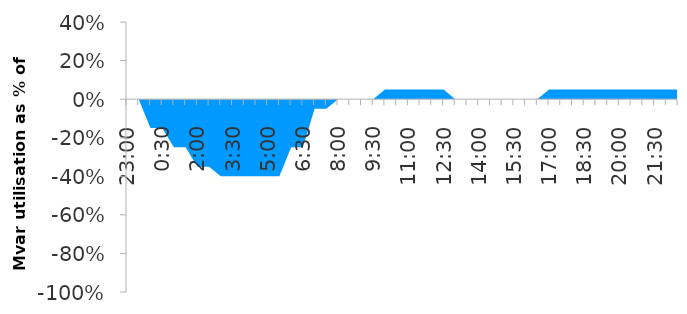
| Category | Series 0 |
|---|---|
| 0.9583333333333334 | 0 |
| 0.9791666666666666 | 0 |
| 0.0 | -0.15 |
| 0.020833333333333332 | -0.15 |
| 0.041666666666666664 | -0.25 |
| 0.0625 | -0.25 |
| 0.08333333333333333 | -0.35 |
| 0.10416666666666667 | -0.35 |
| 0.125 | -0.4 |
| 0.14583333333333334 | -0.4 |
| 0.16666666666666666 | -0.4 |
| 0.1875 | -0.4 |
| 0.20833333333333334 | -0.4 |
| 0.22916666666666666 | -0.4 |
| 0.25 | -0.25 |
| 0.2708333333333333 | -0.25 |
| 0.2916666666666667 | -0.05 |
| 0.3125 | -0.05 |
| 0.3333333333333333 | 0 |
| 0.3541666666666667 | 0 |
| 0.375 | 0 |
| 0.3958333333333333 | 0 |
| 0.4166666666666667 | 0.05 |
| 0.4375 | 0.05 |
| 0.4583333333333333 | 0.05 |
| 0.4791666666666667 | 0.05 |
| 0.5 | 0.05 |
| 0.5208333333333334 | 0.05 |
| 0.5416666666666666 | 0 |
| 0.5625 | 0 |
| 0.5833333333333334 | 0 |
| 0.6041666666666666 | 0 |
| 0.625 | 0 |
| 0.6458333333333334 | 0 |
| 0.6666666666666666 | 0 |
| 0.6875 | 0 |
| 0.7083333333333334 | 0.05 |
| 0.7291666666666666 | 0.05 |
| 0.75 | 0.05 |
| 0.7708333333333334 | 0.05 |
| 0.7916666666666666 | 0.05 |
| 0.8125 | 0.05 |
| 0.8333333333333334 | 0.05 |
| 0.8541666666666666 | 0.05 |
| 0.875 | 0.05 |
| 0.8958333333333334 | 0.05 |
| 0.9166666666666666 | 0.05 |
| 0.9375 | 0.05 |